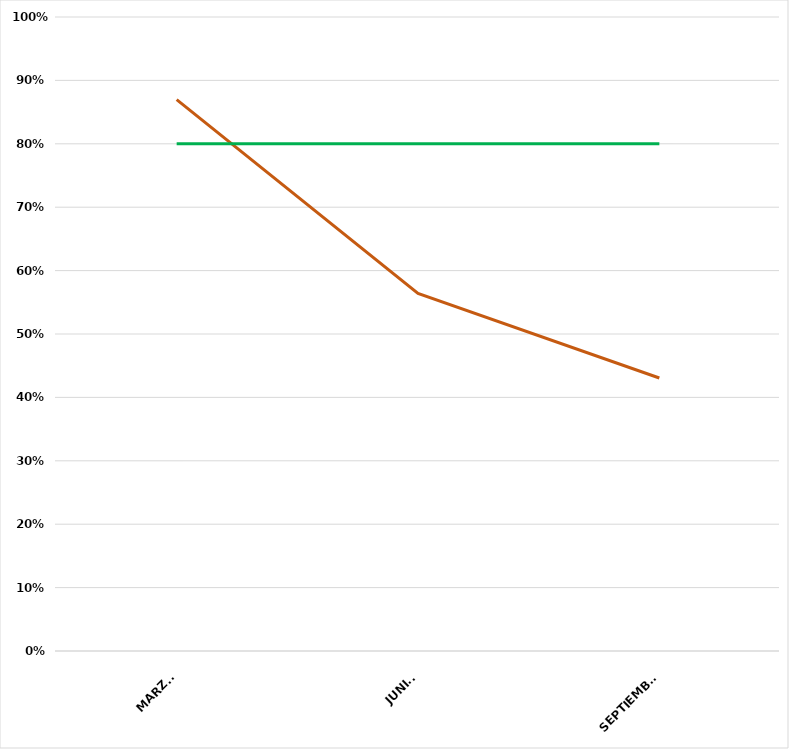
| Category | VALOR  | META PONDERADA |
|---|---|---|
| MARZO | 0.87 | 0.8 |
| JUNIO | 0.564 | 0.8 |
| SEPTIEMBRE | 0.431 | 0.8 |